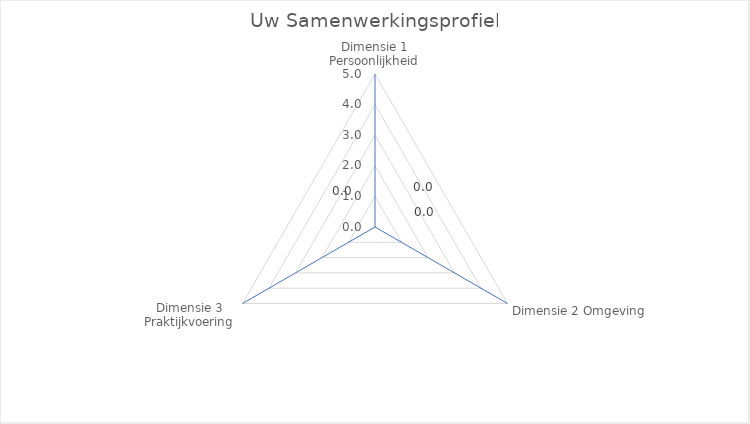
| Category | Series 0 |
|---|---|
| Dimensie 1 Persoonlijkheid | 0 |
| Dimensie 2 Omgeving | 0 |
| Dimensie 3 Praktijkvoering | 0 |